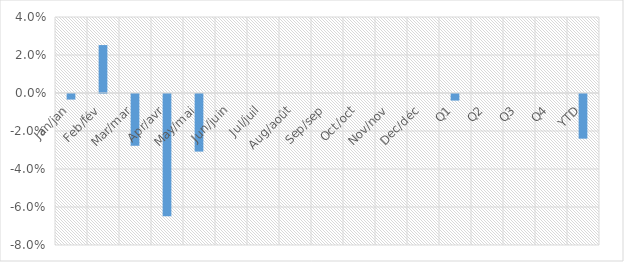
| Category | Total YoY % Change |
|---|---|
| Jan/jan | -0.003 |
| Feb/fév | 0.025 |
| Mar/mar | -0.027 |
| Apr/avr | -0.064 |
| May/mai | -0.03 |
| Jun/juin | 0 |
| Jul/juil | 0 |
| Aug/août | 0 |
| Sep/sep | 0 |
| Oct/oct | 0 |
| Nov/nov | 0 |
| Dec/déc | 0 |
| Q1 | -0.003 |
| Q2 | 0 |
| Q3 | 0 |
| Q4 | 0 |
| YTD | -0.024 |